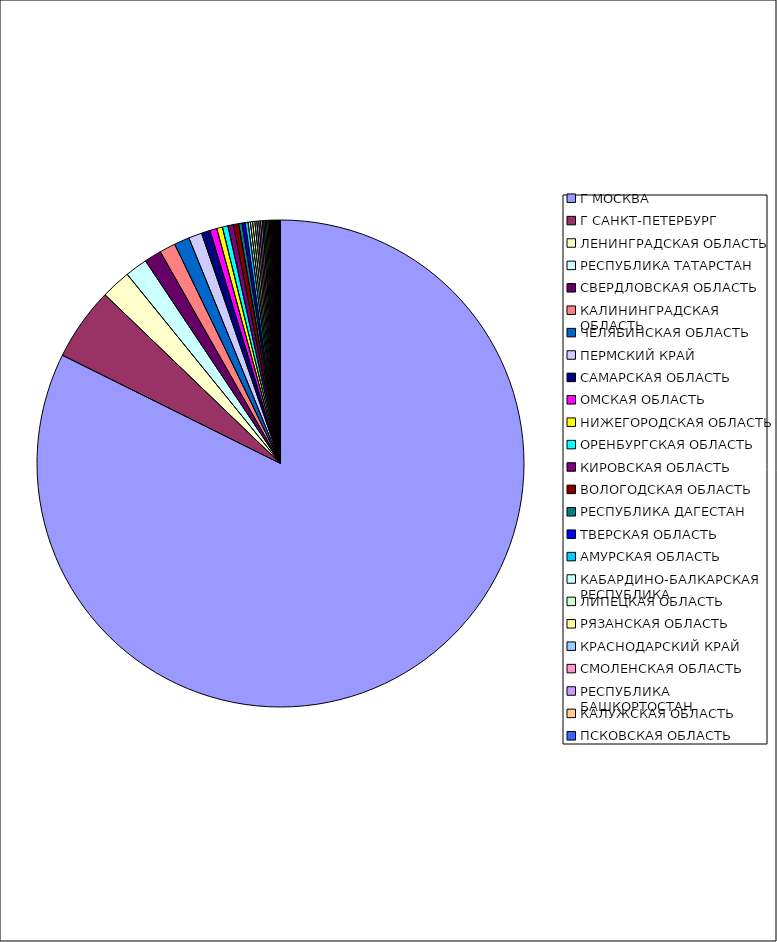
| Category | Оборот |
|---|---|
| Г МОСКВА | 0.822 |
| Г САНКТ-ПЕТЕРБУРГ | 0.048 |
| ЛЕНИНГРАДСКАЯ ОБЛАСТЬ | 0.02 |
| РЕСПУБЛИКА ТАТАРСТАН | 0.015 |
| СВЕРДЛОВСКАЯ ОБЛАСТЬ | 0.011 |
| КАЛИНИНГРАДСКАЯ ОБЛАСТЬ | 0.011 |
| ЧЕЛЯБИНСКАЯ ОБЛАСТЬ | 0.01 |
| ПЕРМСКИЙ КРАЙ | 0.009 |
| САМАРСКАЯ ОБЛАСТЬ | 0.006 |
| ОМСКАЯ ОБЛАСТЬ | 0.005 |
| НИЖЕГОРОДСКАЯ ОБЛАСТЬ | 0.004 |
| ОРЕНБУРГСКАЯ ОБЛАСТЬ | 0.004 |
| КИРОВСКАЯ ОБЛАСТЬ | 0.004 |
| ВОЛОГОДСКАЯ ОБЛАСТЬ | 0.004 |
| РЕСПУБЛИКА ДАГЕСТАН | 0.002 |
| ТВЕРСКАЯ ОБЛАСТЬ | 0.002 |
| АМУРСКАЯ ОБЛАСТЬ | 0.002 |
| КАБАРДИНО-БАЛКАРСКАЯ РЕСПУБЛИКА | 0.001 |
| ЛИПЕЦКАЯ ОБЛАСТЬ | 0.001 |
| РЯЗАНСКАЯ ОБЛАСТЬ | 0.001 |
| КРАСНОДАРСКИЙ КРАЙ | 0.001 |
| СМОЛЕНСКАЯ ОБЛАСТЬ | 0.001 |
| РЕСПУБЛИКА БАШКОРТОСТАН | 0.001 |
| КАЛУЖСКАЯ ОБЛАСТЬ | 0.001 |
| ПСКОВСКАЯ ОБЛАСТЬ | 0.001 |
| ПРИМОРСКИЙ КРАЙ | 0.001 |
| САРАТОВСКАЯ ОБЛАСТЬ | 0.001 |
| ТЮМЕНСКАЯ ОБЛАСТЬ | 0.001 |
| УЛЬЯНОВСКАЯ ОБЛАСТЬ | 0.001 |
| РЕСПУБЛИКА КОМИ | 0.001 |
| СТАВРОПОЛЬСКИЙ КРАЙ | 0.001 |
| УДМУРТСКАЯ РЕСПУБЛИКА | 0.001 |
| РЕСПУБЛИКА МОРДОВИЯ | 0.001 |
| РОСТОВСКАЯ ОБЛАСТЬ | 0.001 |
| КРАСНОЯРСКИЙ КРАЙ | 0.001 |
| ИВАНОВСКАЯ ОБЛАСТЬ | 0.001 |
| АЛТАЙСКИЙ КРАЙ | 0 |
| НОВОСИБИРСКАЯ ОБЛАСТЬ | 0 |
| РЕСПУБЛИКА СЕВЕРНАЯ ОСЕТИЯ-АЛАНИЯ | 0 |
| ИРКУТСКАЯ ОБЛАСТЬ | 0 |
| КАРАЧАЕВО-ЧЕРКЕССКАЯ РЕСПУБЛИКА | 0 |
| ЧУВАШСКАЯ РЕСПУБЛИКА | 0 |
| КУРГАНСКАЯ ОБЛАСТЬ | 0 |
| БЕЛГОРОДСКАЯ ОБЛАСТЬ | 0 |
| ХАБАРОВСКИЙ КРАЙ | 0 |
| МОСКОВСКАЯ ОБЛАСТЬ | 0 |